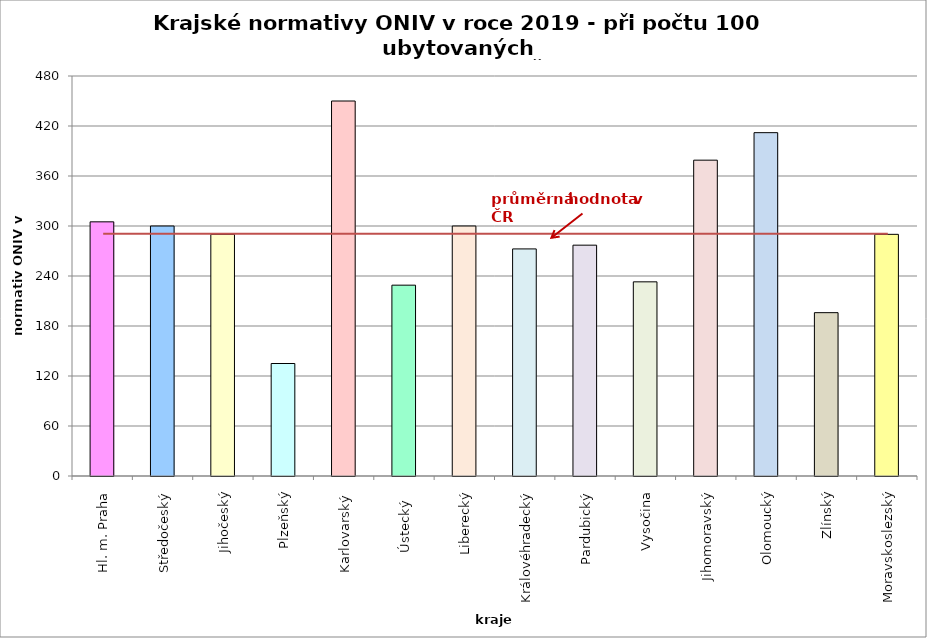
| Category | Series 0 |
|---|---|
| Hl. m. Praha | 305 |
| Středočeský | 300 |
| Jihočeský | 290 |
| Plzeňský | 135 |
| Karlovarský  | 450 |
| Ústecký   | 229 |
| Liberecký | 300 |
| Královéhradecký | 272.5 |
| Pardubický | 277 |
| Vysočina | 233 |
| Jihomoravský | 379 |
| Olomoucký | 412 |
| Zlínský | 196 |
| Moravskoslezský | 290 |